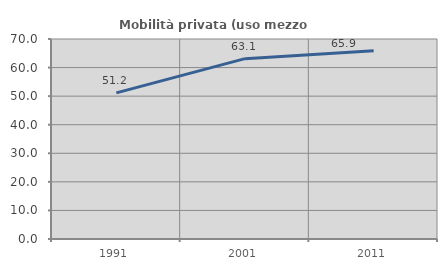
| Category | Mobilità privata (uso mezzo privato) |
|---|---|
| 1991.0 | 51.161 |
| 2001.0 | 63.119 |
| 2011.0 | 65.908 |